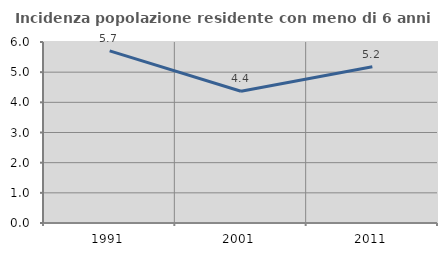
| Category | Incidenza popolazione residente con meno di 6 anni |
|---|---|
| 1991.0 | 5.706 |
| 2001.0 | 4.369 |
| 2011.0 | 5.181 |